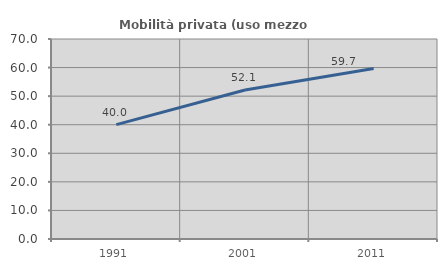
| Category | Mobilità privata (uso mezzo privato) |
|---|---|
| 1991.0 | 40.034 |
| 2001.0 | 52.128 |
| 2011.0 | 59.695 |